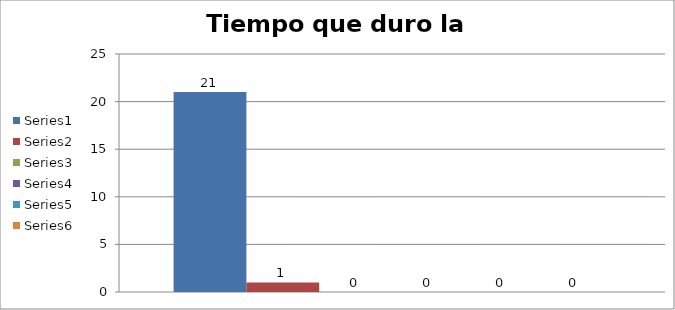
| Category | Series 0 | Series 1 | Series 2 | Series 3 | Series 4 | Series 5 |
|---|---|---|---|---|---|---|
| 0 | 21 | 1 | 0 | 0 | 0 | 0 |